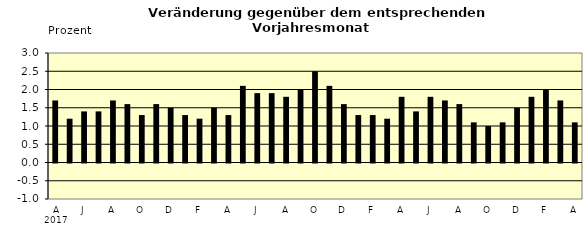
| Category | Series 0 |
|---|---|
| 0 | 1.7 |
| 1 | 1.2 |
| 2 | 1.4 |
| 3 | 1.4 |
| 4 | 1.7 |
| 5 | 1.6 |
| 6 | 1.3 |
| 7 | 1.6 |
| 8 | 1.5 |
| 9 | 1.3 |
| 10 | 1.2 |
| 11 | 1.5 |
| 12 | 1.3 |
| 13 | 2.1 |
| 14 | 1.9 |
| 15 | 1.9 |
| 16 | 1.8 |
| 17 | 2 |
| 18 | 2.5 |
| 19 | 2.1 |
| 20 | 1.6 |
| 21 | 1.3 |
| 22 | 1.3 |
| 23 | 1.2 |
| 24 | 1.8 |
| 25 | 1.4 |
| 26 | 1.8 |
| 27 | 1.7 |
| 28 | 1.6 |
| 29 | 1.1 |
| 30 | 1 |
| 31 | 1.1 |
| 32 | 1.5 |
| 33 | 1.8 |
| 34 | 2 |
| 35 | 1.7 |
| 36 | 1.1 |